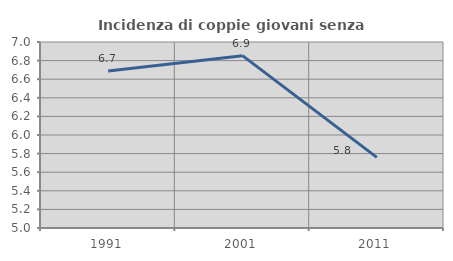
| Category | Incidenza di coppie giovani senza figli |
|---|---|
| 1991.0 | 6.688 |
| 2001.0 | 6.853 |
| 2011.0 | 5.76 |